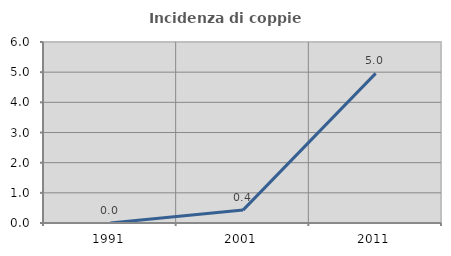
| Category | Incidenza di coppie miste |
|---|---|
| 1991.0 | 0 |
| 2001.0 | 0.427 |
| 2011.0 | 4.959 |